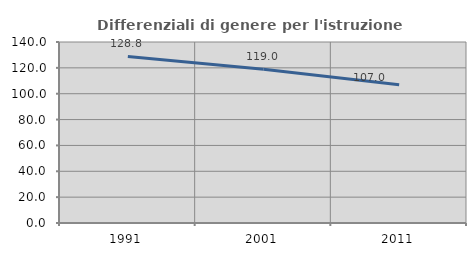
| Category | Differenziali di genere per l'istruzione superiore |
|---|---|
| 1991.0 | 128.789 |
| 2001.0 | 118.989 |
| 2011.0 | 107.009 |